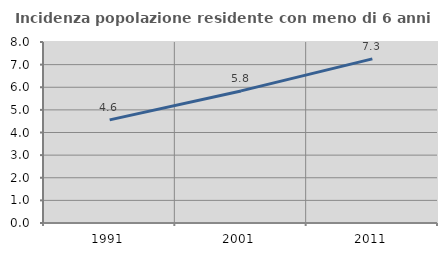
| Category | Incidenza popolazione residente con meno di 6 anni |
|---|---|
| 1991.0 | 4.559 |
| 2001.0 | 5.838 |
| 2011.0 | 7.255 |